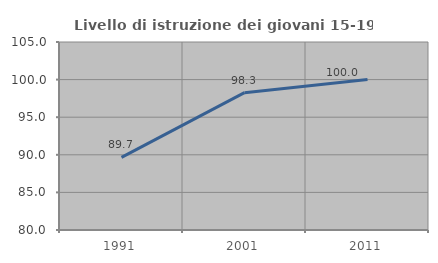
| Category | Livello di istruzione dei giovani 15-19 anni |
|---|---|
| 1991.0 | 89.655 |
| 2001.0 | 98.261 |
| 2011.0 | 100 |